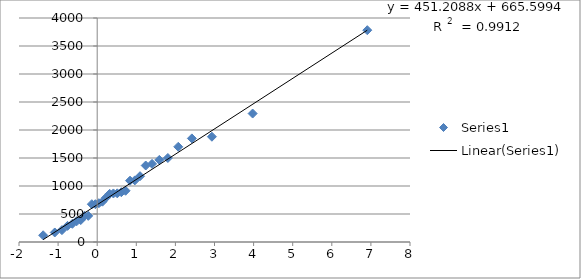
| Category | Series 0 |
|---|---|
| 3.975638920207646 | 2294 |
| 2.9340302942192285 | 1880 |
| 2.4210988817402987 | 1850 |
| 2.0731964562955345 | 1700 |
| 1.8069090056173192 | 1500 |
| 1.589290738360042 | 1466 |
| 1.40389212079904 | 1395 |
| 1.2412906113077722 | 1366 |
| 1.0955679566800844 | 1175 |
| 0.9627484671170798 | 1100 |
| 0.8400180333205504 | 1095 |
| 0.7252971452836122 | 915 |
| 0.6169905096488942 | 889 |
| 0.5138313799041194 | 869 |
| 0.414779526661532 | 867 |
| 0.31895073437986177 | 860 |
| 0.22556508032615413 | 792 |
| 0.1339060434926639 | 720 |
| 0.04328487942514706 | 693 |
| -0.04699438572747659 | 675 |
| -0.137674265448495 | 675 |
| -0.22959407212154703 | 467 |
| -0.3237619540797752 | 467 |
| -0.42146889493536915 | 392 |
| -0.5244866622137399 | 371 |
| -0.6354475034780959 | 325 |
| -0.7586674967981982 | 288 |
| -0.9022656970325924 | 212 |
| -1.0853593828083323 | 170 |
| -1.3825392942187928 | 120 |
| 6.907255070523716 | 3782.223 |